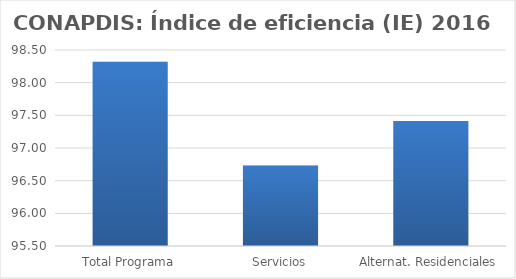
| Category | Índice de eficiencia (IE)  |
|---|---|
| Total Programa | 98.32 |
| Servicios | 96.73 |
| Alternat. Residenciales | 97.415 |